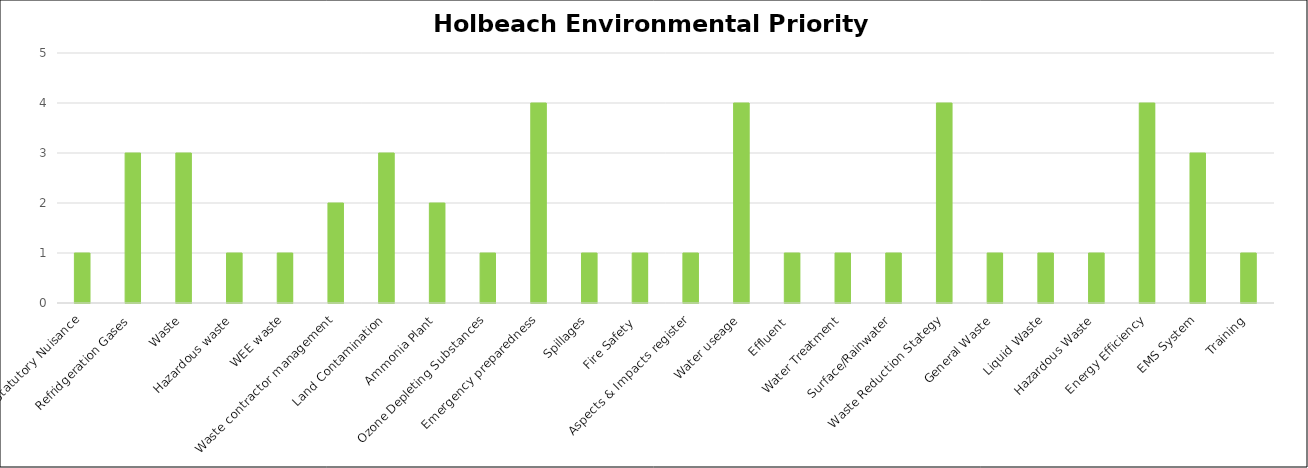
| Category | Series 0 |
|---|---|
| Statutory Nuisance | 1 |
| Refridgeration Gases | 3 |
| Waste | 3 |
| Hazardous waste | 1 |
| WEE waste | 1 |
| Waste contractor management | 2 |
| Land Contamination | 3 |
| Ammonia Plant | 2 |
| Ozone Depleting Substances | 1 |
| Emergency preparedness | 4 |
| Spillages | 1 |
| Fire Safety  | 1 |
| Aspects & Impacts register | 1 |
| Water useage | 4 |
| Effluent  | 1 |
| Water Treatment | 1 |
| Surface/Rainwater | 1 |
| Waste Reduction Stategy | 4 |
| General Waste | 1 |
| Liquid Waste | 1 |
| Hazardous Waste | 1 |
| Energy Efficiency | 4 |
| EMS System | 3 |
| Training | 1 |